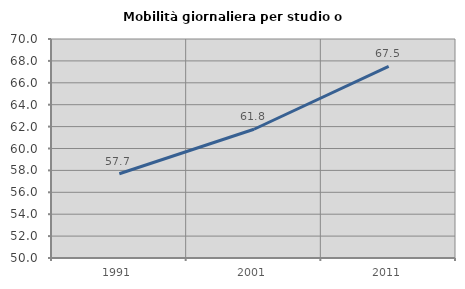
| Category | Mobilità giornaliera per studio o lavoro |
|---|---|
| 1991.0 | 57.69 |
| 2001.0 | 61.759 |
| 2011.0 | 67.508 |